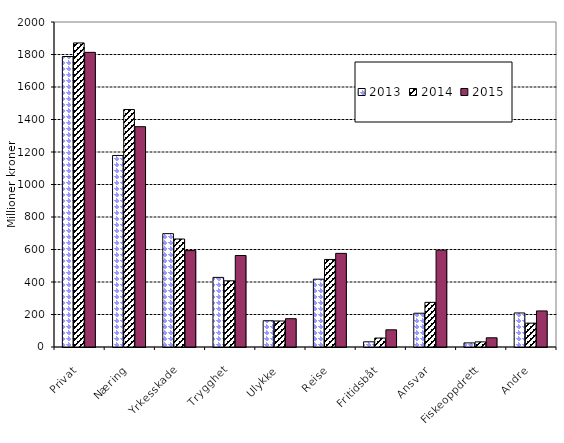
| Category | 2013 | 2014 | 2015 |
|---|---|---|---|
| Privat | 1787.549 | 1871.231 | 1813.252 |
| Næring | 1178.758 | 1461.348 | 1355.81 |
| Yrkesskade | 697.504 | 664.563 | 593.14 |
| Trygghet | 428.309 | 407.336 | 562.936 |
| Ulykke | 161.668 | 160.152 | 174.301 |
| Reise | 417.486 | 538.801 | 576.207 |
| Fritidsbåt | 31.948 | 55.152 | 105.77 |
| Ansvar | 207.845 | 274.756 | 595.919 |
| Fiskeoppdrett | 25.357 | 31.601 | 56.686 |
| Andre | 209.446 | 146.769 | 221.937 |